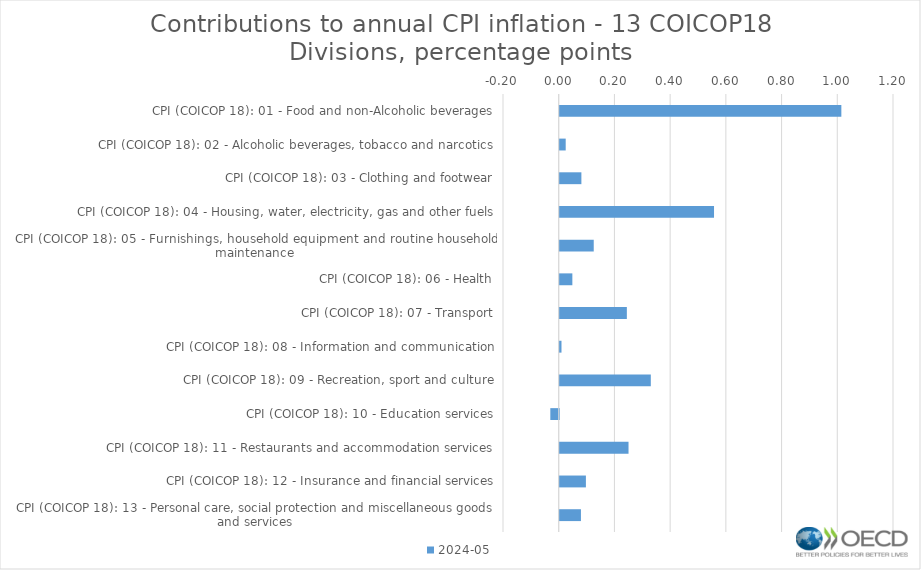
| Category | 2024-05 |
|---|---|
| CPI (COICOP 18): 01 - Food and non-Alcoholic beverages | 1.011 |
| CPI (COICOP 18): 02 - Alcoholic beverages, tobacco and narcotics | 0.022 |
| CPI (COICOP 18): 03 - Clothing and footwear | 0.078 |
| CPI (COICOP 18): 04 - Housing, water, electricity, gas and other fuels | 0.554 |
| CPI (COICOP 18): 05 - Furnishings, household equipment and routine household maintenance | 0.122 |
| CPI (COICOP 18): 06 - Health | 0.045 |
| CPI (COICOP 18): 07 - Transport | 0.241 |
| CPI (COICOP 18): 08 - Information and communication | 0.006 |
| CPI (COICOP 18): 09 - Recreation, sport and culture | 0.327 |
| CPI (COICOP 18): 10 - Education services | -0.03 |
| CPI (COICOP 18): 11 - Restaurants and accommodation services | 0.247 |
| CPI (COICOP 18): 12 - Insurance and financial services | 0.094 |
| CPI (COICOP 18): 13 - Personal care, social protection and miscellaneous goods and services | 0.076 |